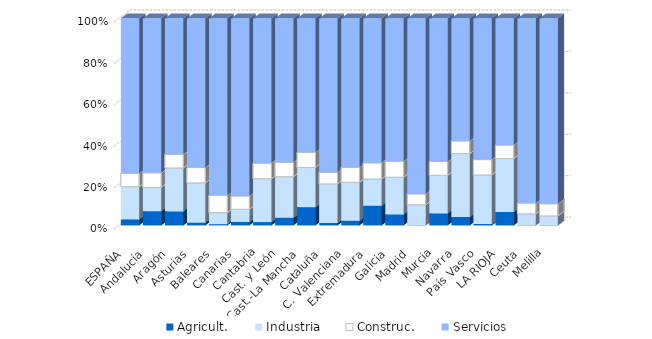
| Category | Agricult. | Industria | Construc. | Servicios |
|---|---|---|---|---|
| ESPAÑA | 2.923 | 15.763 | 6.503 | 74.811 |
| Andalucía | 6.876 | 11.509 | 7.043 | 74.572 |
| Aragón | 6.814 | 20.934 | 6.619 | 65.633 |
| Asturias | 1.369 | 19.179 | 7.405 | 72.046 |
| Baleares | 0.642 | 5.543 | 8.441 | 85.374 |
| Canarias | 1.675 | 6.128 | 6.423 | 85.775 |
| Cantabria | 1.64 | 20.918 | 7.53 | 69.913 |
| Cast. y León | 3.697 | 19.817 | 7.042 | 69.444 |
| Cast.-La Mancha | 8.837 | 19.18 | 7.352 | 64.631 |
| Cataluña | 1.188 | 18.851 | 5.635 | 74.326 |
| C. Valenciana | 2.25 | 18.589 | 7.281 | 71.88 |
| Extremadura | 9.502 | 12.917 | 7.788 | 69.793 |
| Galicia | 5.306 | 17.974 | 7.757 | 68.963 |
| Madrid | 0.059 | 9.918 | 5.22 | 84.804 |
| Murcia | 5.833 | 18.359 | 6.686 | 69.122 |
| Navarra | 4.083 | 30.61 | 6.112 | 59.195 |
| País Vasco | 0.7 | 23.661 | 7.426 | 68.213 |
| LA RIOJA | 6.524 | 25.797 | 6.495 | 61.184 |
| Ceuta | 0.151 | 5.424 | 5.233 | 89.191 |
| Melilla | 0.052 | 4.54 | 5.861 | 89.547 |